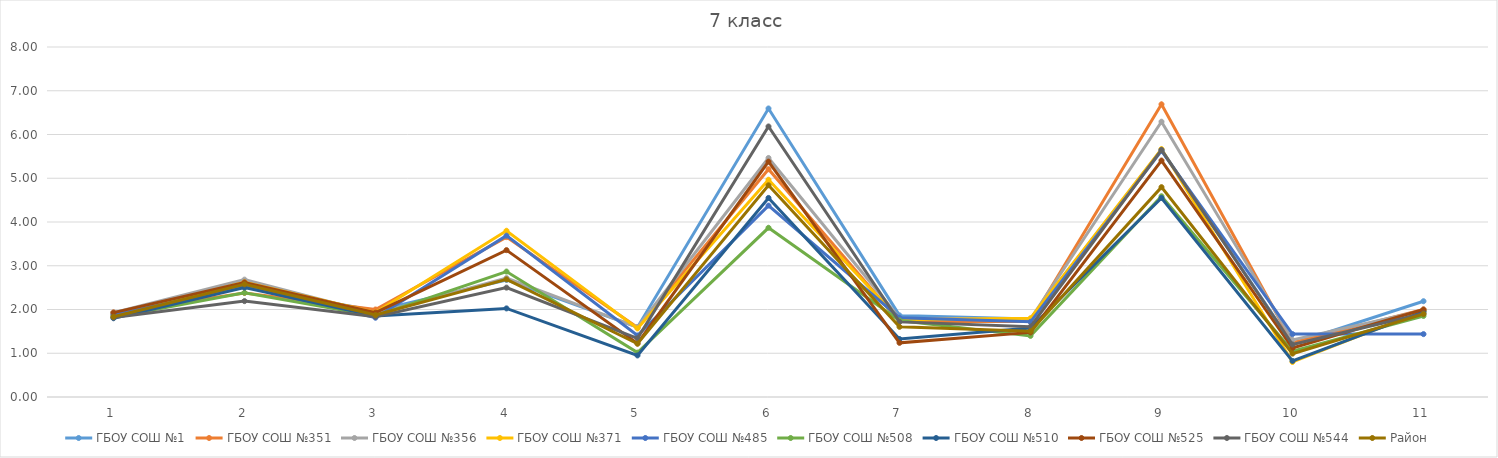
| Category | ГБОУ СОШ №1 | ГБОУ СОШ №351 | ГБОУ СОШ №356 | ГБОУ СОШ №371 | ГБОУ СОШ №485 | ГБОУ СОШ №508 | ГБОУ СОШ №510 | ГБОУ СОШ №525 | ГБОУ СОШ №544 | Район |
|---|---|---|---|---|---|---|---|---|---|---|
| 0 | 1.889 | 1.931 | 1.927 | 1.867 | 1.875 | 1.824 | 1.8 | 1.929 | 1.817 | 1.833 |
| 1 | 2.514 | 2.379 | 2.683 | 2.621 | 2.531 | 2.382 | 2.5 | 2.619 | 2.192 | 2.576 |
| 2 | 1.973 | 2 | 1.902 | 1.933 | 1.812 | 1.853 | 1.85 | 1.929 | 1.833 | 1.873 |
| 3 | 2.676 | 3.655 | 2.72 | 3.8 | 3.688 | 2.868 | 2.025 | 3.357 | 2.5 | 2.689 |
| 4 | 1.595 | 1.586 | 1.598 | 1.567 | 1.406 | 1.015 | 0.95 | 1.226 | 1.342 | 1.218 |
| 5 | 6.595 | 5.207 | 5.463 | 4.967 | 4.375 | 3.868 | 4.55 | 5.38 | 6.183 | 4.84 |
| 6 | 1.865 | 1.724 | 1.805 | 1.767 | 1.812 | 1.75 | 1.325 | 1.238 | 1.717 | 1.604 |
| 7 | 1.784 | 1.724 | 1.78 | 1.8 | 1.719 | 1.397 | 1.575 | 1.476 | 1.608 | 1.502 |
| 8 | 5.649 | 6.69 | 6.293 | 5.667 | 5.625 | 4.588 | 4.55 | 5.405 | 5.65 | 4.796 |
| 9 | 1.216 | 1.241 | 1.305 | 0.8 | 1.438 | 1.044 | 0.825 | 1.119 | 1.2 | 0.991 |
| 10 | 2.189 | 2 | 1.976 | 1.967 | 1.438 | 1.853 | 1.95 | 2 | 1.908 | 1.895 |